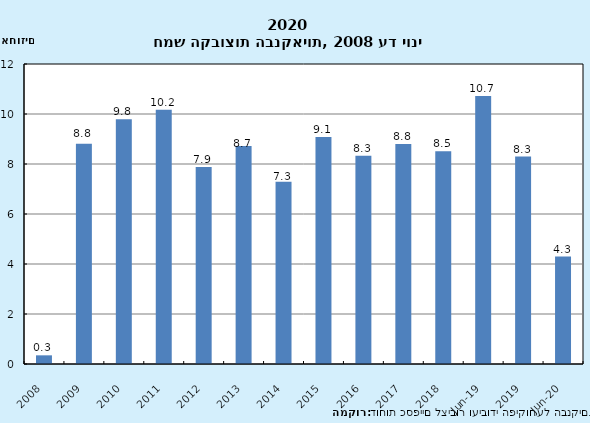
| Category | Series 0 |
|---|---|
| 2008 | 0.347 |
| 2009 | 8.805 |
| 2010 | 9.793 |
| 2011 | 10.175 |
| 2012 | 7.883 |
| 2013 | 8.721 |
| 2014 | 7.285 |
| 2015 | 9.082 |
| 2016 | 8.329 |
| 2017 | 8.801 |
| 2018 | 8.507 |
| יונ-19 | 10.72 |
| 2019 | 8.3 |
| יונ-20 | 4.3 |